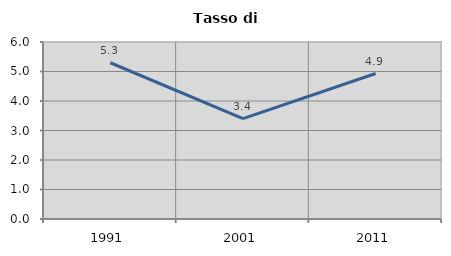
| Category | Tasso di disoccupazione   |
|---|---|
| 1991.0 | 5.297 |
| 2001.0 | 3.401 |
| 2011.0 | 4.932 |